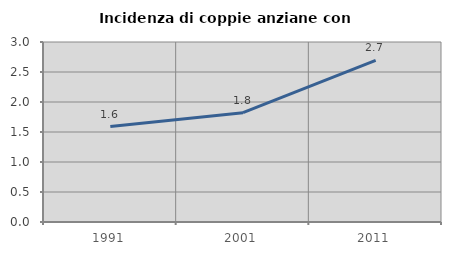
| Category | Incidenza di coppie anziane con figli |
|---|---|
| 1991.0 | 1.591 |
| 2001.0 | 1.822 |
| 2011.0 | 2.693 |